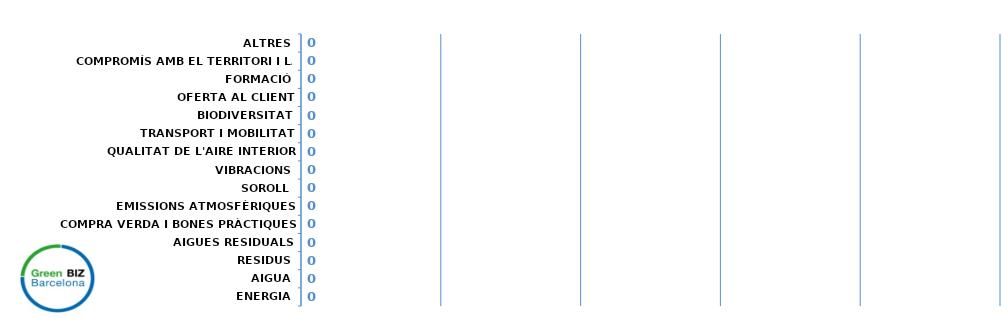
| Category | Series 0 |
|---|---|
| ENERGIA | 0 |
| AIGUA | 0 |
| RESIDUS | 0 |
| AIGUES RESIDUALS | 0 |
| COMPRA VERDA I BONES PRÀCTIQUES | 0 |
| EMISSIONS ATMOSFÈRIQUES | 0 |
| SOROLL | 0 |
| VIBRACIONS | 0 |
| QUALITAT DE L'AIRE INTERIOR | 0 |
| TRANSPORT I MOBILITAT | 0 |
| BIODIVERSITAT | 0 |
| OFERTA AL CLIENT | 0 |
| FORMACIÓ | 0 |
| COMPROMÍS AMB EL TERRITORI I LA SOCIETAT | 0 |
| ALTRES | 0 |